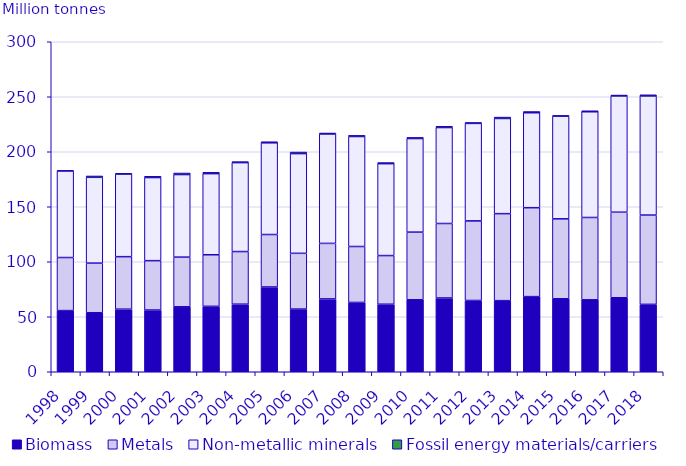
| Category | Biomass | Metals | Non-metallic minerals | Fossil energy materials/carriers |
|---|---|---|---|---|
| 1998.0 | 55.605 | 48.234 | 78.756 | 0.319 |
| 1999.0 | 53.658 | 45.113 | 77.989 | 1.234 |
| 2000.0 | 56.896 | 47.732 | 75.055 | 0.712 |
| 2001.0 | 56.119 | 44.862 | 75.561 | 1.169 |
| 2002.0 | 59.06 | 45.156 | 75.047 | 1.406 |
| 2003.0 | 59.466 | 46.889 | 73.732 | 1.243 |
| 2004.0 | 61.445 | 47.83 | 80.845 | 0.894 |
| 2005.0 | 77.068 | 47.687 | 83.378 | 1 |
| 2006.0 | 56.978 | 50.691 | 90.646 | 1.427 |
| 2007.0 | 66.226 | 50.466 | 99.471 | 0.878 |
| 2008.0 | 63.014 | 50.844 | 99.977 | 1.071 |
| 2009.0 | 61.399 | 44.222 | 83.551 | 1.002 |
| 2010.0 | 65.421 | 61.516 | 85.067 | 1.039 |
| 2011.0 | 67.068 | 67.717 | 87.229 | 1.125 |
| 2012.0 | 64.789 | 72.374 | 88.61 | 0.847 |
| 2013.0 | 64.637 | 79.086 | 86.528 | 1.255 |
| 2014.0 | 68.303 | 80.836 | 86.326 | 1.112 |
| 2015.0 | 66.335 | 72.694 | 93.26 | 0.718 |
| 2016.0 | 65.388 | 74.864 | 96.106 | 0.925 |
| 2017.0 | 67.259 | 77.785 | 105.683 | 0.825 |
| 2018.0 | 61.277 | 81.173 | 108.293 | 1.04 |